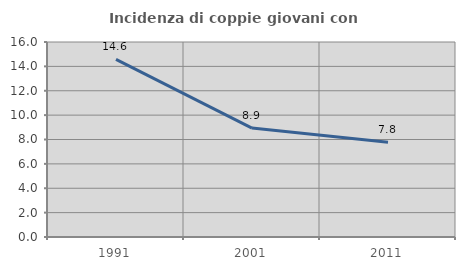
| Category | Incidenza di coppie giovani con figli |
|---|---|
| 1991.0 | 14.574 |
| 2001.0 | 8.935 |
| 2011.0 | 7.78 |